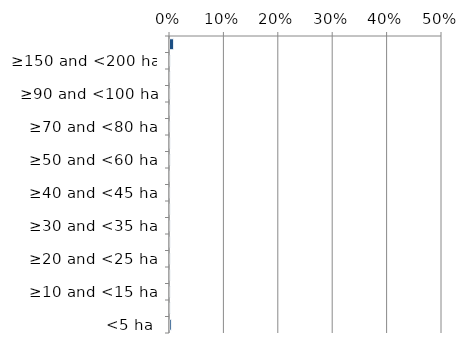
| Category | Near native & fragments |
|---|---|
| <5 ha | 0.002 |
| ≥5 and <10 ha | 0.001 |
| ≥10 and <15 ha | 0.001 |
| ≥15 and <20 ha | 0 |
| ≥20 and <25 ha | 0 |
| ≥25 and <30 ha | 0 |
| ≥30 and <35 ha | 0 |
| ≥35 and <40 ha | 0 |
| ≥40 and <45 ha | 0 |
| ≥45 and <50 ha | 0 |
| ≥50 and <60 ha | 0.001 |
| ≥60 and <70 ha | 0 |
| ≥70 and <80 ha | 0 |
| ≥80 and <90 ha | 0 |
| ≥90 and <100 ha | 0 |
| ≥100 and <150 ha | 0.001 |
| ≥150 and <200 ha | 0 |
| ≥200 ha | 0.007 |